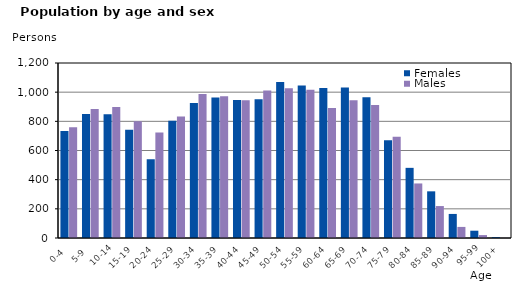
| Category | Females | Males |
|---|---|---|
|   0-4  | 733 | 759 |
|   5-9  | 851 | 885 |
| 10-14 | 848 | 898 |
| 15-19  | 743 | 800 |
| 20-24  | 540 | 724 |
| 25-29  | 804 | 834 |
| 30-34  | 925 | 988 |
| 35-39  | 963 | 972 |
| 40-44  | 947 | 944 |
| 45-49  | 951 | 1011 |
| 50-54  | 1070 | 1027 |
| 55-59  | 1045 | 1016 |
| 60-64  | 1029 | 891 |
| 65-69  | 1032 | 944 |
| 70-74  | 966 | 912 |
| 75-79  | 671 | 694 |
| 80-84  | 481 | 374 |
| 85-89  | 320 | 219 |
| 90-94  | 165 | 76 |
| 95-99 | 50 | 20 |
| 100+ | 6 | 1 |